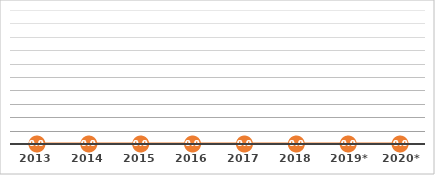
| Category | ALUMNOS BECADOS (%) |
|---|---|
| 2013 | 0 |
| 2014 | 0 |
| 2015 | 0 |
| 2016 | 0 |
| 2017 | 0 |
| 2018 | 0 |
| 2019* | 0 |
| 2020* | 0 |